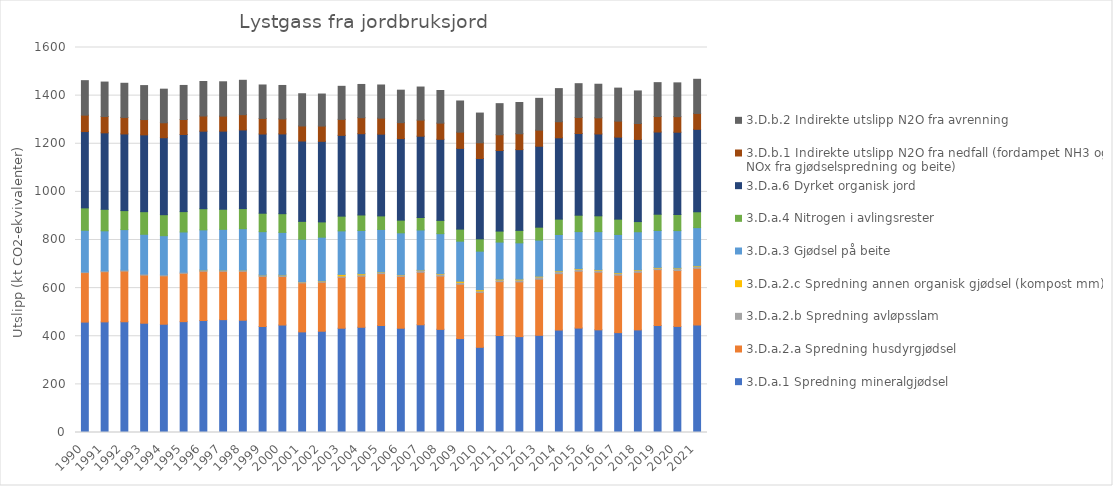
| Category | 3.D.a.1 Spredning mineralgjødsel | 3.D.a.2.a Spredning husdyrgjødsel | 3.D.a.2.b Spredning avløpsslam | 3.D.a.2.c Spredning annen organisk gjødsel (kompost mm) | 3.D.a.3 Gjødsel på beite | 3.D.a.4 Nitrogen i avlingsrester | 3.D.a.6 Dyrket organisk jord | 3.D.b.1 Indirekte utslipp N2O fra nedfall (fordampet NH3 og NOx fra gjødselspredning og beite) | 3.D.b.2 Indirekte utslipp N2O fra avrenning |
|---|---|---|---|---|---|---|---|---|---|
| 1990.0 | 458.829 | 205.579 | 3.071 | 0 | 173.004 | 93.078 | 317.139 | 68.174 | 143.305 |
| 1991.0 | 459.727 | 208.429 | 3.908 | 0 | 166.168 | 89.287 | 317.832 | 68.086 | 142.925 |
| 1992.0 | 460.233 | 210.531 | 4.449 | 0 | 167.952 | 79.016 | 318.524 | 68.677 | 141.912 |
| 1993.0 | 454.121 | 199.937 | 4.686 | 0 | 165 | 93.968 | 319.217 | 63.558 | 141.241 |
| 1994.0 | 449.957 | 200.934 | 4.454 | 0 | 162.614 | 87.185 | 319.909 | 62.124 | 139.658 |
| 1995.0 | 460.698 | 200.57 | 4.896 | 0 | 167.185 | 84.65 | 320.602 | 62.27 | 141.436 |
| 1996.0 | 465.32 | 204.769 | 4.955 | 0.029 | 167.032 | 87.974 | 322.189 | 63.106 | 143.392 |
| 1997.0 | 469.012 | 200.769 | 4.96 | 0.029 | 169.528 | 83.592 | 324.53 | 62.392 | 142.698 |
| 1998.0 | 466.657 | 203.045 | 5.027 | 0.029 | 172.131 | 83.59 | 326.872 | 63.462 | 142.896 |
| 1999.0 | 440.397 | 208.346 | 5.599 | 0.029 | 180.245 | 76.697 | 329.214 | 64.66 | 139.05 |
| 2000.0 | 446.635 | 201.539 | 5.555 | 0.715 | 177.185 | 77.726 | 331.556 | 62.291 | 139.029 |
| 2001.0 | 418.175 | 203.522 | 4.966 | 0.729 | 175.726 | 74.349 | 333.898 | 62.493 | 133.972 |
| 2002.0 | 420.889 | 203.53 | 5.115 | 1.046 | 181.216 | 63.439 | 334.874 | 63.365 | 133.179 |
| 2003.0 | 433.399 | 211.618 | 5.799 | 6.111 | 181.047 | 61.163 | 335.85 | 66.446 | 137.235 |
| 2004.0 | 437.326 | 212.192 | 5.832 | 4.439 | 179.95 | 64.274 | 337.801 | 66.487 | 138.119 |
| 2005.0 | 444.736 | 215.395 | 6.179 | 1.187 | 176.387 | 56.295 | 339.753 | 66.497 | 137.761 |
| 2006.0 | 433.296 | 215.594 | 5.968 | 1.222 | 173.727 | 52.748 | 338.777 | 66.316 | 134.966 |
| 2007.0 | 447.686 | 218.129 | 7.57 | 1.513 | 166.831 | 51.818 | 337.873 | 66.943 | 137.352 |
| 2008.0 | 428.59 | 221.586 | 8.003 | 2.086 | 166.096 | 55.227 | 336.969 | 67.238 | 135.468 |
| 2009.0 | 390.232 | 225.891 | 7.701 | 4.87 | 166.502 | 50.148 | 335.383 | 67.47 | 129.536 |
| 2010.0 | 354.036 | 227.936 | 6.722 | 4.891 | 160.116 | 51.221 | 333.796 | 65.409 | 123.399 |
| 2011.0 | 403.011 | 223.865 | 7.5 | 2.97 | 154.052 | 45.672 | 334.88 | 65.461 | 129.195 |
| 2012.0 | 398.449 | 227.487 | 8.231 | 3.155 | 150.856 | 51.862 | 335.635 | 65.858 | 129.915 |
| 2013.0 | 403.977 | 233.19 | 9.704 | 2.543 | 150.154 | 53.735 | 336.39 | 66.797 | 132.17 |
| 2014.0 | 425.748 | 234.342 | 9.194 | 2.543 | 151.061 | 63.924 | 337.888 | 66.799 | 137.66 |
| 2015.0 | 433.977 | 236.163 | 8.328 | 2.543 | 153.843 | 68.225 | 339.386 | 66.959 | 140.208 |
| 2016.0 | 426.674 | 239.663 | 7.719 | 2.543 | 158.203 | 65.717 | 340.166 | 67.078 | 139.571 |
| 2017.0 | 415.071 | 238.681 | 7.748 | 2.543 | 158.941 | 63.754 | 340.811 | 66.462 | 137.214 |
| 2018.0 | 426.39 | 239.31 | 7.678 | 2.543 | 158.37 | 42.253 | 341.457 | 66.044 | 135.46 |
| 2019.0 | 444.601 | 232.222 | 6.646 | 2.543 | 153.611 | 67.483 | 341.731 | 64.436 | 140.676 |
| 2020.0 | 440.932 | 232.121 | 8.072 | 2.543 | 155.41 | 66.906 | 342.005 | 64.718 | 140.336 |
| 2021.0 | 446.754 | 235.418 | 8.031 | 2.543 | 158.682 | 65.905 | 342.638 | 65.991 | 141.921 |